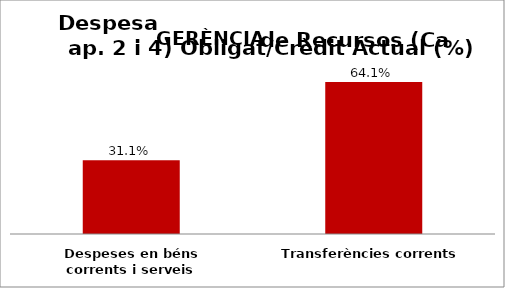
| Category | Series 0 |
|---|---|
| Despeses en béns corrents i serveis | 0.311 |
| Transferències corrents | 0.641 |